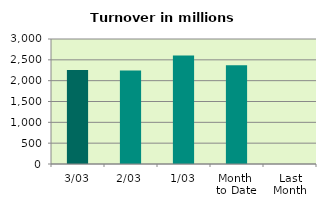
| Category | Series 0 |
|---|---|
| 3/03 | 2254.786 |
| 2/03 | 2245.909 |
| 1/03 | 2606.75 |
| Month 
to Date | 2369.148 |
| Last
Month | 0 |